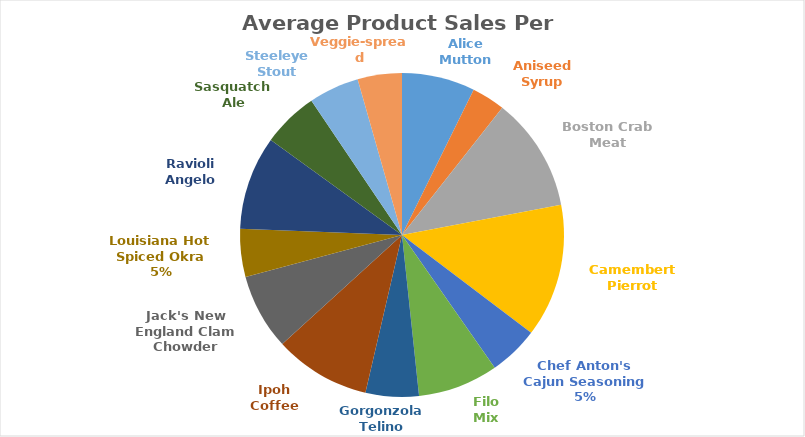
| Category | Sum of Avg Sales Per Qtr |
|---|---|
| Alice Mutton | 7728.5 |
| Aniseed Syrup | 3519.25 |
| Boston Crab Meat | 12056 |
| Camembert Pierrot | 14107.25 |
| Chef Anton's Cajun Seasoning | 5271 |
| Filo Mix | 8492.25 |
| Gorgonzola Telino | 5623.75 |
| Ipoh Coffee | 10177.5 |
| Jack's New England Clam Chowder | 8048.75 |
| Louisiana Hot Spiced Okra | 5052.5 |
| Ravioli Angelo | 9920.25 |
| Sasquatch Ale | 5910.75 |
| Steeleye Stout | 5323 |
| Veggie-spread | 4678 |